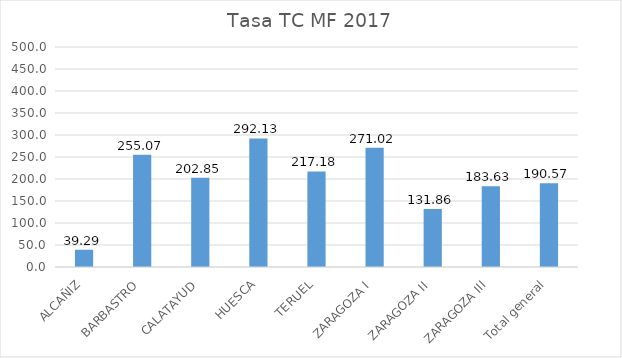
| Category | 2017 |
|---|---|
| ALCAÑIZ | 39.286 |
| BARBASTRO | 255.072 |
| CALATAYUD | 202.85 |
| HUESCA | 292.135 |
| TERUEL | 217.182 |
| ZARAGOZA I | 271.019 |
| ZARAGOZA II | 131.864 |
| ZARAGOZA III | 183.626 |
| Total general | 190.572 |